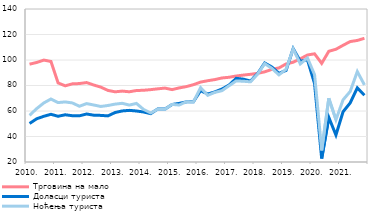
| Category | Трговина на мало | Доласци туриста | Ноћења туриста  |
|---|---|---|---|
| 2010. | 96.734 | 50.215 | 56.603 |
| II | 98.065 | 53.898 | 61.879 |
| III | 99.934 | 55.845 | 66.326 |
| IV | 98.846 | 57.416 | 69.405 |
| 2011. | 82.028 | 55.866 | 66.609 |
| II | 79.758 | 57.031 | 67.123 |
| III | 81.281 | 56.305 | 66.337 |
| IV | 81.531 | 56.225 | 63.729 |
| 2012. | 82.296 | 57.643 | 65.802 |
| II | 80.401 | 56.728 | 64.735 |
| III | 78.715 | 56.555 | 63.558 |
| IV | 76.144 | 56.175 | 64.326 |
| 2013. | 75.044 | 58.796 | 65.395 |
| II | 75.605 | 60.041 | 66.026 |
| III | 75.082 | 60.502 | 64.648 |
| IV | 76.062 | 60.007 | 65.933 |
| 2014. | 76.259 | 59.226 | 61.245 |
| II | 76.754 | 57.938 | 58.458 |
| III | 77.397 | 61.606 | 61.447 |
| IV | 77.96 | 61.479 | 61.411 |
| 2015. | 76.778 | 65.109 | 65.16 |
| II | 78.105 | 65.955 | 64.707 |
| III | 79.132 | 67.164 | 67.263 |
| IV | 80.646 | 67.265 | 67.021 |
| 2016. | 82.672 | 75.964 | 78.324 |
| II | 83.751 | 73.305 | 72.31 |
| III | 84.639 | 74.966 | 74.594 |
| IV | 85.908 | 77.205 | 75.944 |
| 2017. | 86.455 | 80.362 | 79.82 |
| II | 87.428 | 85.601 | 83.58 |
| III | 88.168 | 84.988 | 83.345 |
| IV | 88.781 | 83.506 | 82.875 |
| 2018. | 89.522 | 89.265 | 88.892 |
| II | 90.715 | 97.663 | 97.177 |
| III | 92.636 | 94.535 | 93.478 |
| IV | 93.777 | 89.539 | 88.359 |
| 2019. | 96.899 | 91.851 | 92.751 |
| II | 98.268 | 108.963 | 108.71 |
| III | 100.928 | 98.995 | 96.942 |
| IV | 103.906 | 100.192 | 101.598 |
| 2020. | 104.865 | 81.495 | 88.525 |
| II | 97.353 | 22.687 | 29.102 |
| III | 106.852 | 54.941 | 69.973 |
| IV | 108.415 | 41.149 | 53.127 |
| 2021. | 111.53 | 59.447 | 68.747 |
| II | 114.475 | 66.289 | 75.318 |
| III | 115.333 | 78.067 | 90.914 |
| IV | 117.033 | 72.316 | 80.466 |